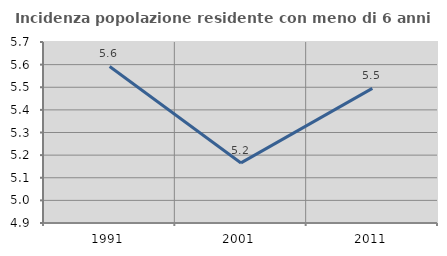
| Category | Incidenza popolazione residente con meno di 6 anni |
|---|---|
| 1991.0 | 5.592 |
| 2001.0 | 5.166 |
| 2011.0 | 5.495 |